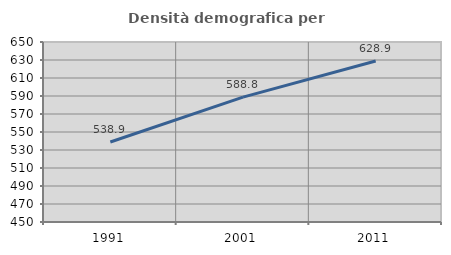
| Category | Densità demografica |
|---|---|
| 1991.0 | 538.875 |
| 2001.0 | 588.78 |
| 2011.0 | 628.932 |